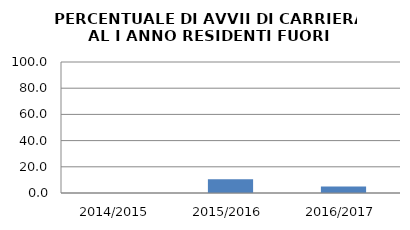
| Category | 2014/2015 2015/2016 2016/2017 |
|---|---|
| 2014/2015 | 0 |
| 2015/2016 | 10.526 |
| 2016/2017 | 5 |